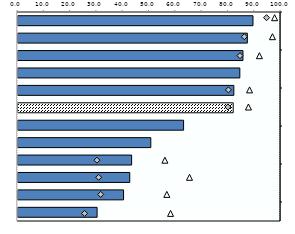
| Category | 25-64 |
|---|---|
| 0 | 89.353 |
| 1 | 87.2 |
| 2 | 85.538 |
| 3 | 84.35 |
| 4 | 82.069 |
| 5 | 81.82 |
| 6 | 62.96 |
| 7 | 50.499 |
| 8 | 43.2 |
| 9 | 42.494 |
| 10 | 40.132 |
| 11 | 30.076 |